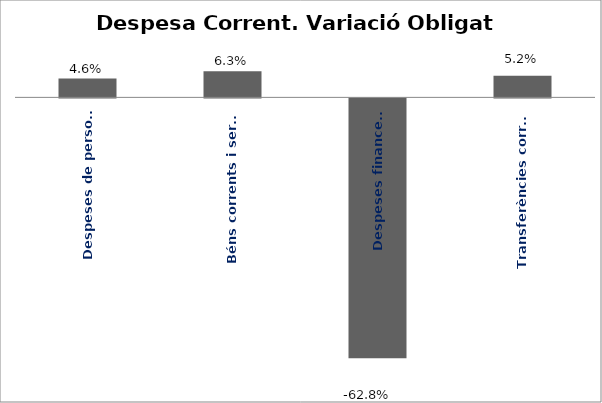
| Category | Series 0 |
|---|---|
| Despeses de personal | 0.046 |
| Béns corrents i serveis | 0.063 |
| Despeses financeres | -0.628 |
| Transferències corrents | 0.052 |